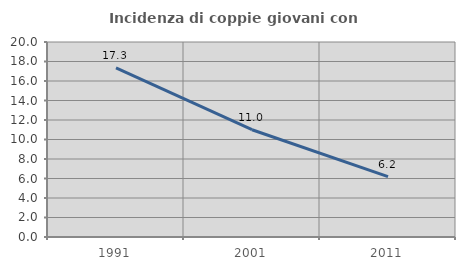
| Category | Incidenza di coppie giovani con figli |
|---|---|
| 1991.0 | 17.337 |
| 2001.0 | 11.002 |
| 2011.0 | 6.198 |